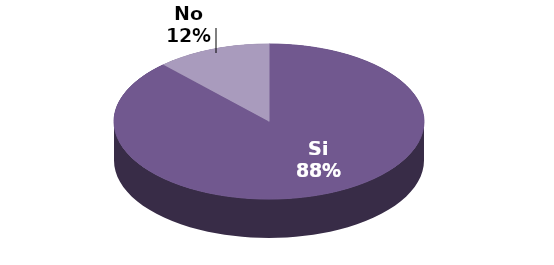
| Category | Series 1 |
|---|---|
| Si | 214 |
| No | 29 |